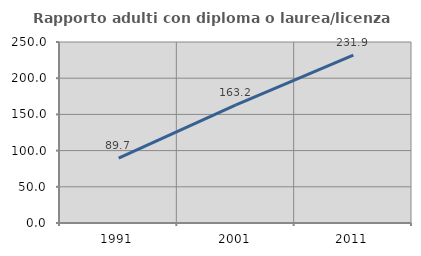
| Category | Rapporto adulti con diploma o laurea/licenza media  |
|---|---|
| 1991.0 | 89.748 |
| 2001.0 | 163.25 |
| 2011.0 | 231.86 |